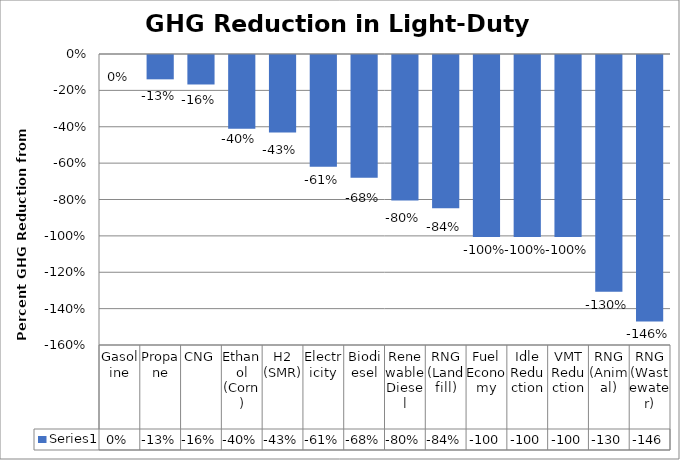
| Category | Series 0 |
|---|---|
| Gasoline | 0 |
| Propane | -0.134 |
| CNG | -0.162 |
| Ethanol (Corn) | -0.405 |
| H2 (SMR) | -0.426 |
| Electricity | -0.615 |
| Biodiesel | -0.676 |
| Renewable Diesel | -0.8 |
| RNG (Landfill) | -0.843 |
| Fuel Economy | -1 |
| Idle Reduction | -1 |
| VMT Reduction | -1 |
| RNG (Animal) | -1.302 |
| RNG (Wastewater) | -1.465 |